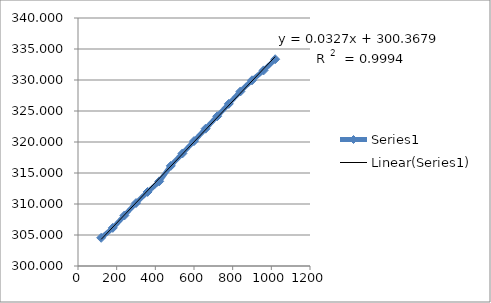
| Category | Series 0 |
|---|---|
| 120.0 | 304.55 |
| 180.0 | 306.15 |
| 240.0 | 308.15 |
| 300.0 | 310.15 |
| 360.0 | 311.95 |
| 420.0 | 313.65 |
| 480.0 | 316.15 |
| 540.0 | 318.15 |
| 600.0 | 320.15 |
| 660.0 | 322.15 |
| 720.0 | 324.15 |
| 780.0 | 326.15 |
| 840.0 | 328.15 |
| 900.0 | 329.95 |
| 960.0 | 331.55 |
| 1020.0 | 333.35 |